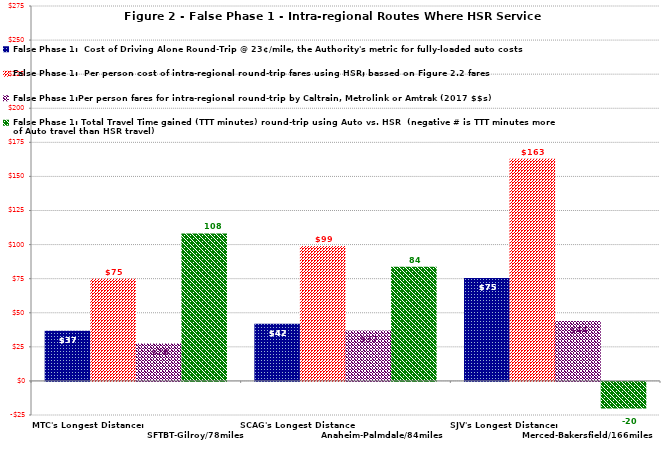
| Category | False Phase 1:  Cost of Driving Alone Round-Trip @ 23¢/mile, the Authority's metric for fully-loaded auto costs | False Phase 1:  Per person cost of intra-regional round-trip fares using HSR; bassed on Figure 2.2 fares | False Phase 1:Per person fares for intra-regional round-trip by Caltrain, Metrolink or Amtrak (2017 $$s) | False Phase 1: Total Travel Time gained (TTT minutes) round-trip using Auto vs. HSR  (negative # is TTT minutes more of Auto travel than HSR travel) |
|---|---|---|---|---|
| MTC's Longest Distance:                                                                         SFTBT-Gilroy/78miles | 36.8 | 75 | 27.5 | 108.2 |
| SCAG's Longest Distance                                                           Anaheim-Palmdale/84miles | 41.86 | 99 | 37 | 83.8 |
| SJV's Longest Distance:                                                          Merced-Bakersfield/166miles | 75.44 | 163 | 44 | -19.5 |